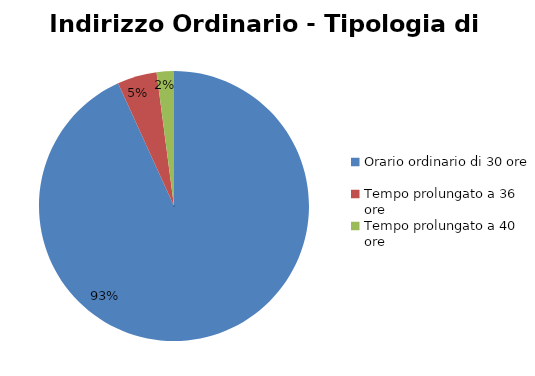
| Category | Series 0 |
|---|---|
| Orario ordinario di 30 ore | 33075 |
| Tempo prolungato a 36 ore | 1680 |
| Tempo prolungato a 40 ore | 734 |